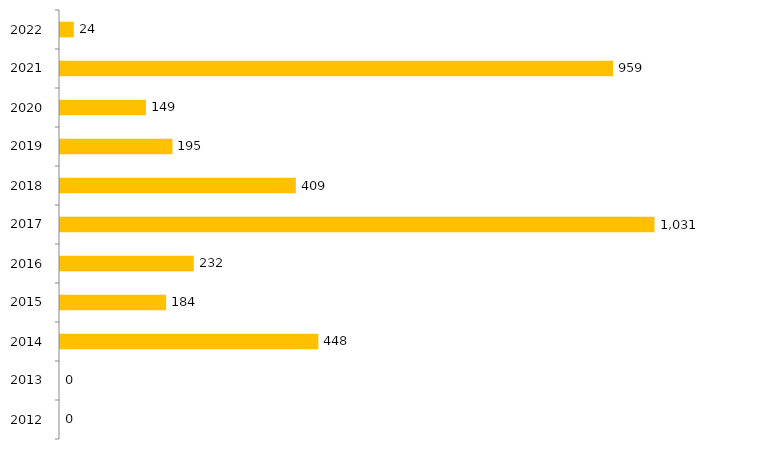
| Category | Series 1 |
|---|---|
| 2012.0 | 0 |
| 2013.0 | 0 |
| 2014.0 | 448 |
| 2015.0 | 184 |
| 2016.0 | 232 |
| 2017.0 | 1031 |
| 2018.0 | 409 |
| 2019.0 | 195 |
| 2020.0 | 149 |
| 2021.0 | 959 |
| 2022.0 | 24 |